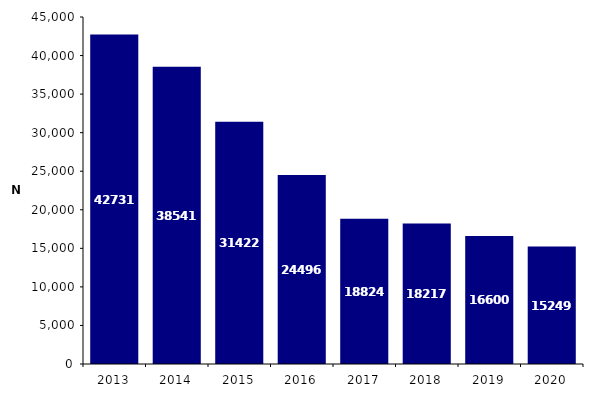
| Category | Caryotypes foetaux |
|---|---|
| 2013.0 | 42731 |
| 2014.0 | 38541 |
| 2015.0 | 31422 |
| 2016.0 | 24496 |
| 2017.0 | 18824 |
| 2018.0 | 18217 |
| 2019.0 | 16600 |
| 2020.0 | 15249 |